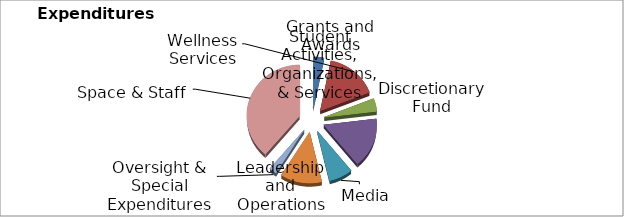
| Category | Series 0 |
|---|---|
| _x0011_Grants and Awards | 22000 |
| _x0011_Wellness Services | 107900 |
| _x0012_Discretionary Fund | 27500 |
| -Student Activities, Organizations, & Services | 108256 |
| _x0005_Media | 49383 |
| _x0019_Leadership and Operations | 86374.77 |
|  Oversight & Special Expenditures | 15284 |
| _x000d_Space & Staff | 263903 |